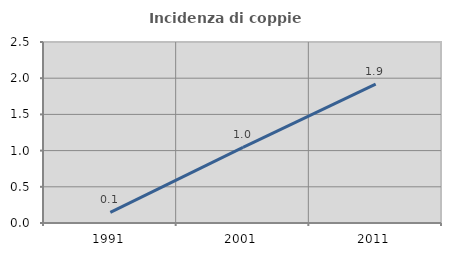
| Category | Incidenza di coppie miste |
|---|---|
| 1991.0 | 0.147 |
| 2001.0 | 1.045 |
| 2011.0 | 1.917 |